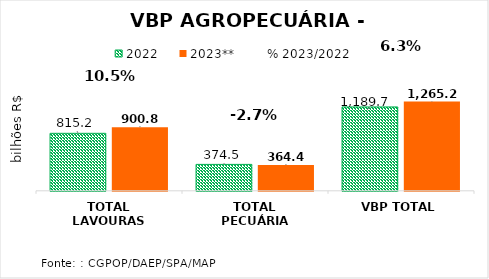
| Category | 2022 | 2023** |
|---|---|---|
| TOTAL LAVOURAS | 815.219 | 900.805 |
| TOTAL PECUÁRIA | 374.479 | 364.422 |
| VBP TOTAL | 1189.698 | 1265.227 |